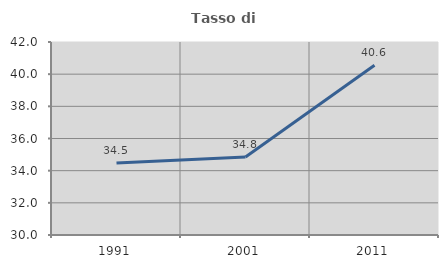
| Category | Tasso di occupazione   |
|---|---|
| 1991.0 | 34.484 |
| 2001.0 | 34.845 |
| 2011.0 | 40.553 |